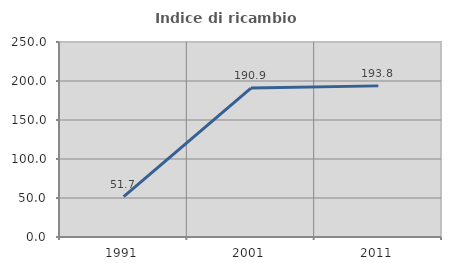
| Category | Indice di ricambio occupazionale  |
|---|---|
| 1991.0 | 51.724 |
| 2001.0 | 190.909 |
| 2011.0 | 193.75 |